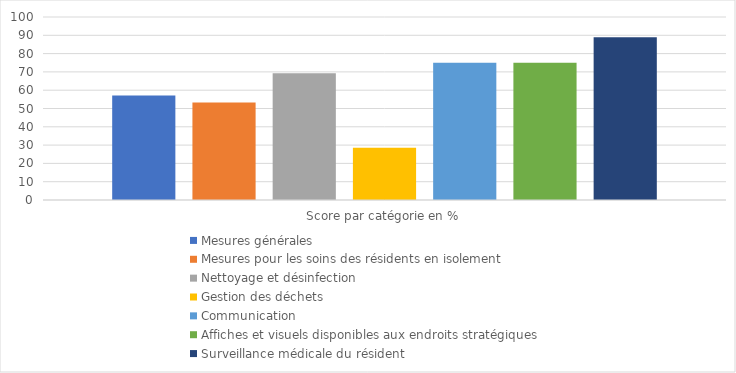
| Category | Mesures générales  | Mesures pour les soins des résidents en isolement  | Nettoyage et désinfection | Gestion des déchets | Communication  | Affiches et visuels disponibles aux endroits stratégiques | Surveillance médicale du résident |
|---|---|---|---|---|---|---|---|
| Score par catégorie en % | 57.143 | 53.333 | 69.231 | 28.571 | 75 | 75 | 88.889 |